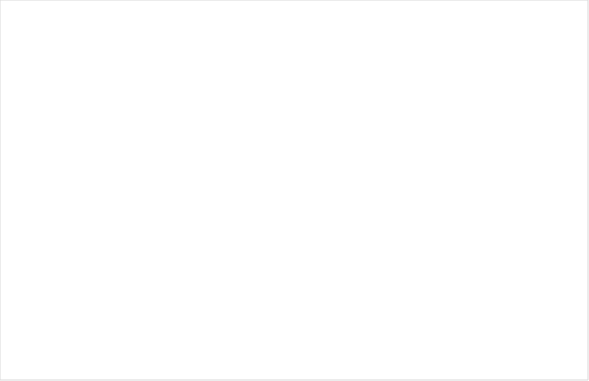
| Category | Ingen brist | Föreläggande | Föreläggande vid vite | Anmärkning | Avstående från ingripande |
|---|---|---|---|---|---|
| Enskild en enhet | 0.423 | 0.519 | 0.058 | 0 | 0 |
| Enskild flera enhet | 0.581 | 0.338 | 0.014 | 0.068 | 0 |
| Offentlig | 0.548 | 0.428 | 0.016 | 0.005 | 0.002 |